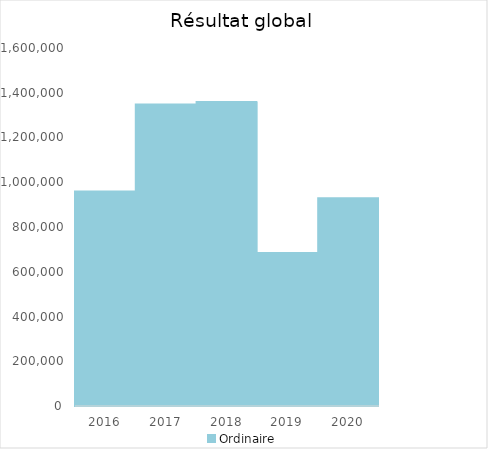
| Category |   | Ordinaire |    |
|---|---|---|---|
| 2016.0 |  | 958545.37 |  |
| 2017.0 |  | 1347400.11 |  |
| 2018.0 |  | 1359077.73 |  |
| 2019.0 |  | 683381.05 |  |
| 2020.0 |  | 928337.44 |  |